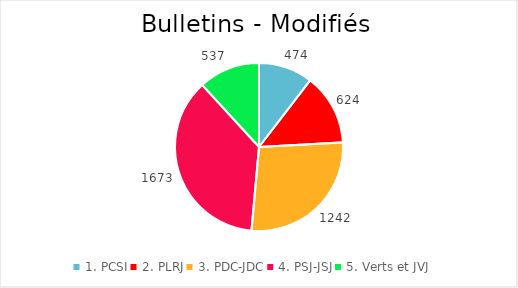
| Category | Series 0 |
|---|---|
| 1. PCSI | 474 |
| 2. PLRJ | 624 |
| 3. PDC-JDC | 1242 |
| 4. PSJ-JSJ | 1673 |
| 5. Verts et JVJ | 537 |